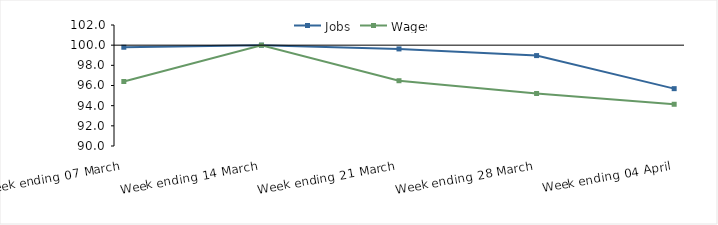
| Category | Jobs | Wages |
|---|---|---|
| 0 | 99.795 | 96.398 |
| 1900-01-01 | 100 | 100 |
| 1900-01-02 | 99.628 | 96.473 |
| 1900-01-03 | 98.966 | 95.208 |
| 1900-01-04 | 95.688 | 94.139 |